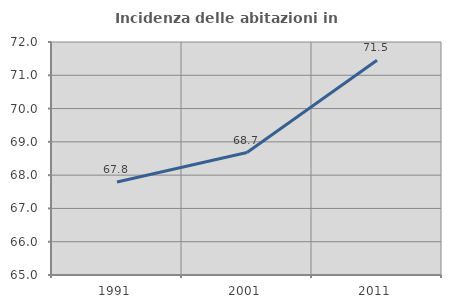
| Category | Incidenza delle abitazioni in proprietà  |
|---|---|
| 1991.0 | 67.793 |
| 2001.0 | 68.679 |
| 2011.0 | 71.454 |